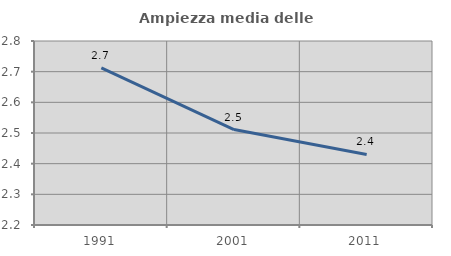
| Category | Ampiezza media delle famiglie |
|---|---|
| 1991.0 | 2.712 |
| 2001.0 | 2.511 |
| 2011.0 | 2.43 |